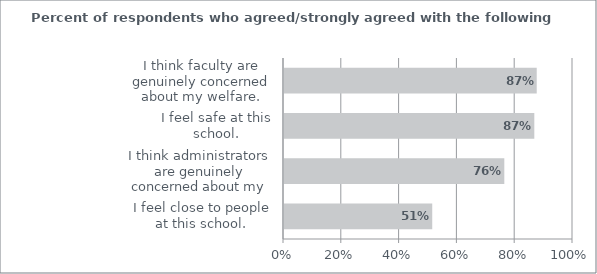
| Category | Strongly Agree/Agree |
|---|---|
| I feel close to people at this school. | 0.513 |
| I think administrators are genuinely concerned about my welfare. | 0.762 |
| I feel safe at this school. | 0.866 |
| I think faculty are genuinely concerned about my welfare. | 0.874 |